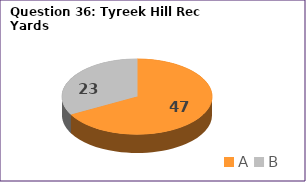
| Category | Series 0 |
|---|---|
| A | 47 |
| B | 23 |